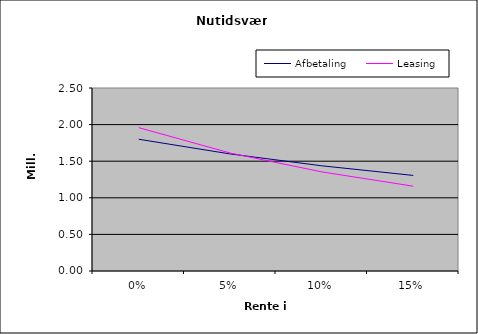
| Category | Afbetaling | Leasing |
|---|---|---|
| 0.0 | 1800000 | 1958400 |
| 0.05 | 1598843.001 | 1611559.098 |
| 0.1 | 1437236.031 | 1353992.258 |
| 0.15 | 1305646.529 | 1158488.188 |